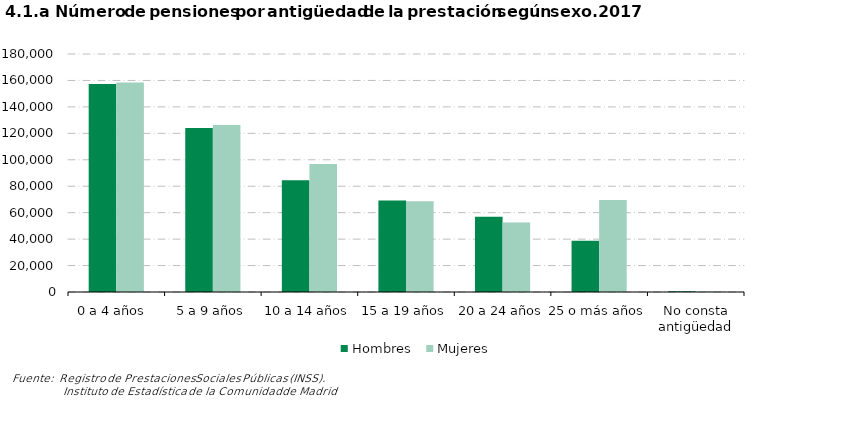
| Category | Hombres | Mujeres |
|---|---|---|
| 0 a 4 años  | 157324 | 158456 |
| 5 a 9 años | 124116 | 126302 |
| 10 a 14 años | 84558 | 96891 |
| 15 a 19 años | 69238 | 68583 |
| 20 a 24 años | 56905 | 52651 |
| 25 o más años | 38827 | 69650 |
| No consta antigüedad | 527 | 294 |